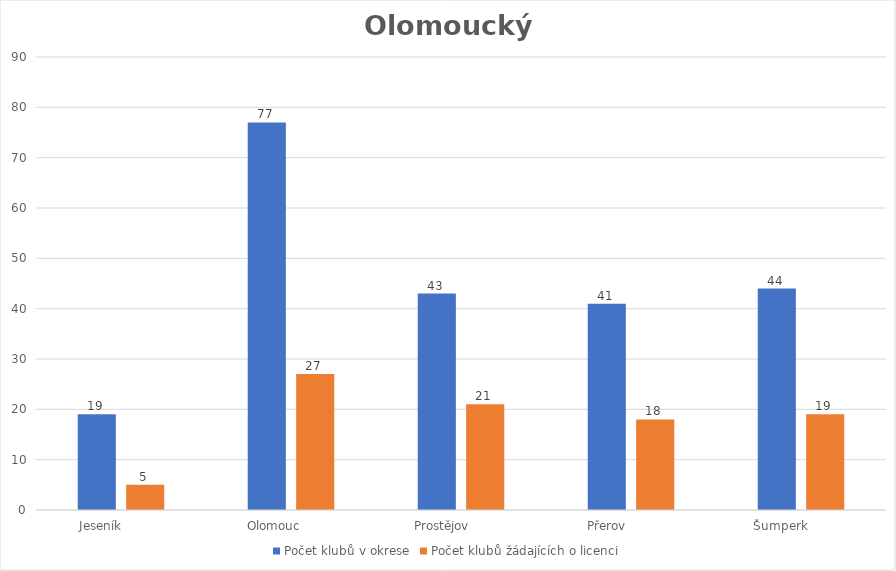
| Category | Počet klubů v okrese | Počet klubů žádajících o licenci |
|---|---|---|
| Jeseník           | 19 | 5 |
| Olomouc         | 77 | 27 |
| Prostějov          | 43 | 21 |
| Přerov             | 41 | 18 |
| Šumperk           | 44 | 19 |